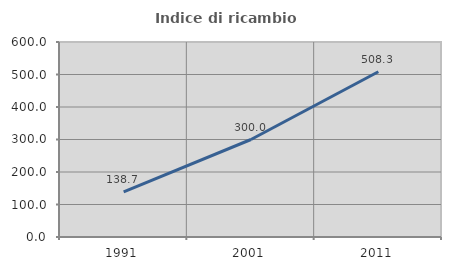
| Category | Indice di ricambio occupazionale  |
|---|---|
| 1991.0 | 138.71 |
| 2001.0 | 300 |
| 2011.0 | 508.333 |